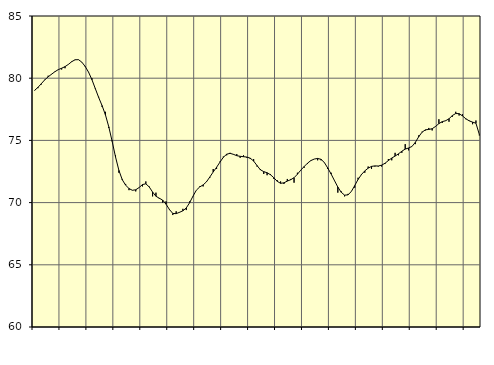
| Category | Piggar | Series 1 |
|---|---|---|
| nan | 79 | 79.03 |
| 87.0 | 79.2 | 79.27 |
| 87.0 | 79.5 | 79.57 |
| 87.0 | 79.9 | 79.87 |
| nan | 80.2 | 80.11 |
| 88.0 | 80.3 | 80.32 |
| 88.0 | 80.5 | 80.52 |
| 88.0 | 80.7 | 80.69 |
| nan | 80.7 | 80.8 |
| 89.0 | 80.8 | 80.93 |
| 89.0 | 81.1 | 81.11 |
| 89.0 | 81.3 | 81.33 |
| nan | 81.5 | 81.48 |
| 90.0 | 81.5 | 81.49 |
| 90.0 | 81.3 | 81.29 |
| 90.0 | 80.9 | 80.94 |
| nan | 80.5 | 80.48 |
| 91.0 | 80 | 79.88 |
| 91.0 | 79.2 | 79.16 |
| 91.0 | 78.5 | 78.45 |
| nan | 77.7 | 77.8 |
| 92.0 | 77.3 | 77.06 |
| 92.0 | 76 | 76.09 |
| 92.0 | 75 | 74.92 |
| nan | 73.8 | 73.67 |
| 93.0 | 72.4 | 72.59 |
| 93.0 | 71.9 | 71.84 |
| 93.0 | 71.5 | 71.4 |
| nan | 71 | 71.13 |
| 94.0 | 71 | 70.99 |
| 94.0 | 70.9 | 71.03 |
| 94.0 | 71.2 | 71.21 |
| nan | 71.3 | 71.45 |
| 95.0 | 71.7 | 71.51 |
| 95.0 | 71.3 | 71.26 |
| 95.0 | 70.5 | 70.85 |
| nan | 70.8 | 70.51 |
| 96.0 | 70.3 | 70.35 |
| 96.0 | 70 | 70.2 |
| 96.0 | 70.1 | 69.87 |
| nan | 69.4 | 69.45 |
| 97.0 | 69 | 69.13 |
| 97.0 | 69.3 | 69.11 |
| 97.0 | 69.2 | 69.22 |
| nan | 69.5 | 69.34 |
| 98.0 | 69.4 | 69.57 |
| 98.0 | 70.1 | 69.99 |
| 98.0 | 70.5 | 70.52 |
| nan | 71 | 71 |
| 99.0 | 71.3 | 71.26 |
| 99.0 | 71.3 | 71.42 |
| 99.0 | 71.7 | 71.67 |
| nan | 72 | 72.06 |
| 0.0 | 72.7 | 72.46 |
| 0.0 | 72.7 | 72.84 |
| 0.0 | 73.3 | 73.25 |
| nan | 73.7 | 73.64 |
| 1.0 | 73.8 | 73.89 |
| 1.0 | 74 | 73.96 |
| 1.0 | 73.9 | 73.88 |
| nan | 73.9 | 73.77 |
| 2.0 | 73.6 | 73.72 |
| 2.0 | 73.8 | 73.69 |
| 2.0 | 73.6 | 73.66 |
| nan | 73.5 | 73.57 |
| 3.0 | 73.5 | 73.34 |
| 3.0 | 72.9 | 72.98 |
| 3.0 | 72.7 | 72.64 |
| nan | 72.3 | 72.49 |
| 4.0 | 72.2 | 72.4 |
| 4.0 | 72.3 | 72.24 |
| 4.0 | 71.9 | 72 |
| nan | 71.8 | 71.71 |
| 5.0 | 71.7 | 71.55 |
| 5.0 | 71.5 | 71.59 |
| 5.0 | 71.9 | 71.73 |
| nan | 71.9 | 71.84 |
| 6.0 | 71.6 | 72 |
| 6.0 | 72.4 | 72.28 |
| 6.0 | 72.6 | 72.61 |
| nan | 72.8 | 72.9 |
| 7.0 | 73.1 | 73.17 |
| 7.0 | 73.4 | 73.38 |
| 7.0 | 73.5 | 73.5 |
| nan | 73.4 | 73.55 |
| 8.0 | 73.4 | 73.48 |
| 8.0 | 73.2 | 73.22 |
| 8.0 | 72.7 | 72.78 |
| nan | 72.4 | 72.3 |
| 9.0 | 71.8 | 71.77 |
| 9.0 | 70.8 | 71.25 |
| 9.0 | 70.9 | 70.83 |
| nan | 70.5 | 70.6 |
| 10.0 | 70.7 | 70.62 |
| 10.0 | 70.9 | 70.89 |
| 10.0 | 71.2 | 71.36 |
| nan | 72 | 71.86 |
| 11.0 | 72.3 | 72.25 |
| 11.0 | 72.4 | 72.55 |
| 11.0 | 72.9 | 72.77 |
| nan | 72.7 | 72.91 |
| 12.0 | 72.9 | 72.95 |
| 12.0 | 72.9 | 72.94 |
| 12.0 | 72.9 | 73.01 |
| nan | 73.1 | 73.16 |
| 13.0 | 73.5 | 73.38 |
| 13.0 | 73.4 | 73.58 |
| 13.0 | 74 | 73.74 |
| nan | 73.8 | 73.92 |
| 14.0 | 74 | 74.13 |
| 14.0 | 74.7 | 74.3 |
| 14.0 | 74.2 | 74.39 |
| nan | 74.5 | 74.51 |
| 15.0 | 74.7 | 74.84 |
| 15.0 | 75.4 | 75.29 |
| 15.0 | 75.7 | 75.66 |
| nan | 75.8 | 75.85 |
| 16.0 | 76 | 75.88 |
| 16.0 | 75.8 | 75.94 |
| 16.0 | 76.1 | 76.12 |
| nan | 76.7 | 76.35 |
| 17.0 | 76.4 | 76.51 |
| 17.0 | 76.6 | 76.58 |
| 17.0 | 76.5 | 76.74 |
| nan | 76.9 | 77 |
| 18.0 | 77.3 | 77.16 |
| 18.0 | 77 | 77.15 |
| 18.0 | 77.1 | 76.97 |
| nan | 76.7 | 76.74 |
| 19.0 | 76.6 | 76.57 |
| 19.0 | 76.3 | 76.47 |
| 19.0 | 76.6 | 76.38 |
| nan | 75.4 | 75.48 |